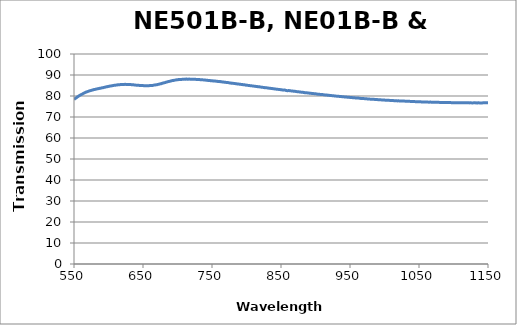
| Category | Series 0 |
|---|---|
| 1150.0 | 76.731 |
| 1149.0 | 76.735 |
| 1148.0 | 76.752 |
| 1147.0 | 76.76 |
| 1146.0 | 76.748 |
| 1145.0 | 76.768 |
| 1144.0 | 76.753 |
| 1143.0 | 76.76 |
| 1142.0 | 76.707 |
| 1141.0 | 76.696 |
| 1140.0 | 76.7 |
| 1139.0 | 76.693 |
| 1138.0 | 76.709 |
| 1137.0 | 76.736 |
| 1136.0 | 76.754 |
| 1135.0 | 76.686 |
| 1134.0 | 76.74 |
| 1133.0 | 76.704 |
| 1132.0 | 76.725 |
| 1131.0 | 76.747 |
| 1130.0 | 76.732 |
| 1129.0 | 76.726 |
| 1128.0 | 76.723 |
| 1127.0 | 76.714 |
| 1126.0 | 76.728 |
| 1125.0 | 76.756 |
| 1124.0 | 76.749 |
| 1123.0 | 76.722 |
| 1122.0 | 76.741 |
| 1121.0 | 76.758 |
| 1120.0 | 76.779 |
| 1119.0 | 76.778 |
| 1118.0 | 76.743 |
| 1117.0 | 76.752 |
| 1116.0 | 76.754 |
| 1115.0 | 76.759 |
| 1114.0 | 76.764 |
| 1113.0 | 76.776 |
| 1112.0 | 76.769 |
| 1111.0 | 76.793 |
| 1110.0 | 76.777 |
| 1109.0 | 76.79 |
| 1108.0 | 76.782 |
| 1107.0 | 76.77 |
| 1106.0 | 76.774 |
| 1105.0 | 76.804 |
| 1104.0 | 76.837 |
| 1103.0 | 76.837 |
| 1102.0 | 76.823 |
| 1101.0 | 76.84 |
| 1100.0 | 76.822 |
| 1099.0 | 76.821 |
| 1098.0 | 76.82 |
| 1097.0 | 76.835 |
| 1096.0 | 76.85 |
| 1095.0 | 76.884 |
| 1094.0 | 76.891 |
| 1093.0 | 76.9 |
| 1092.0 | 76.884 |
| 1091.0 | 76.892 |
| 1090.0 | 76.878 |
| 1089.0 | 76.886 |
| 1088.0 | 76.858 |
| 1087.0 | 76.9 |
| 1086.0 | 76.913 |
| 1085.0 | 76.924 |
| 1084.0 | 76.914 |
| 1083.0 | 76.92 |
| 1082.0 | 76.916 |
| 1081.0 | 76.93 |
| 1080.0 | 76.938 |
| 1079.0 | 76.976 |
| 1078.0 | 76.967 |
| 1077.0 | 76.969 |
| 1076.0 | 76.982 |
| 1075.0 | 77.013 |
| 1074.0 | 77.021 |
| 1073.0 | 77 |
| 1072.0 | 77.013 |
| 1071.0 | 77.022 |
| 1070.0 | 77.044 |
| 1069.0 | 77.051 |
| 1068.0 | 77.059 |
| 1067.0 | 77.091 |
| 1066.0 | 77.101 |
| 1065.0 | 77.067 |
| 1064.0 | 77.06 |
| 1063.0 | 77.094 |
| 1062.0 | 77.092 |
| 1061.0 | 77.11 |
| 1060.0 | 77.131 |
| 1059.0 | 77.154 |
| 1058.0 | 77.158 |
| 1057.0 | 77.163 |
| 1056.0 | 77.172 |
| 1055.0 | 77.168 |
| 1054.0 | 77.157 |
| 1053.0 | 77.211 |
| 1052.0 | 77.227 |
| 1051.0 | 77.246 |
| 1050.0 | 77.252 |
| 1049.0 | 77.249 |
| 1048.0 | 77.273 |
| 1047.0 | 77.282 |
| 1046.0 | 77.271 |
| 1045.0 | 77.293 |
| 1044.0 | 77.328 |
| 1043.0 | 77.353 |
| 1042.0 | 77.351 |
| 1041.0 | 77.374 |
| 1040.0 | 77.36 |
| 1039.0 | 77.368 |
| 1038.0 | 77.387 |
| 1037.0 | 77.437 |
| 1036.0 | 77.443 |
| 1035.0 | 77.473 |
| 1034.0 | 77.463 |
| 1033.0 | 77.468 |
| 1032.0 | 77.483 |
| 1031.0 | 77.515 |
| 1030.0 | 77.551 |
| 1029.0 | 77.562 |
| 1028.0 | 77.573 |
| 1027.0 | 77.564 |
| 1026.0 | 77.59 |
| 1025.0 | 77.584 |
| 1024.0 | 77.616 |
| 1023.0 | 77.633 |
| 1022.0 | 77.66 |
| 1021.0 | 77.672 |
| 1020.0 | 77.693 |
| 1019.0 | 77.667 |
| 1018.0 | 77.692 |
| 1017.0 | 77.725 |
| 1016.0 | 77.757 |
| 1015.0 | 77.766 |
| 1014.0 | 77.782 |
| 1013.0 | 77.803 |
| 1012.0 | 77.823 |
| 1011.0 | 77.846 |
| 1010.0 | 77.859 |
| 1009.0 | 77.865 |
| 1008.0 | 77.887 |
| 1007.0 | 77.923 |
| 1006.0 | 77.947 |
| 1005.0 | 77.968 |
| 1004.0 | 77.977 |
| 1003.0 | 77.993 |
| 1002.0 | 78 |
| 1001.0 | 78.02 |
| 1000.0 | 78.052 |
| 999.0 | 78.08 |
| 998.0 | 78.099 |
| 997.0 | 78.108 |
| 996.0 | 78.136 |
| 995.0 | 78.162 |
| 994.0 | 78.194 |
| 993.0 | 78.222 |
| 992.0 | 78.215 |
| 991.0 | 78.229 |
| 990.0 | 78.271 |
| 989.0 | 78.301 |
| 988.0 | 78.312 |
| 987.0 | 78.337 |
| 986.0 | 78.372 |
| 985.0 | 78.399 |
| 984.0 | 78.405 |
| 983.0 | 78.431 |
| 982.0 | 78.464 |
| 981.0 | 78.484 |
| 980.0 | 78.484 |
| 979.0 | 78.508 |
| 978.0 | 78.54 |
| 977.0 | 78.586 |
| 976.0 | 78.599 |
| 975.0 | 78.617 |
| 974.0 | 78.661 |
| 973.0 | 78.694 |
| 972.0 | 78.706 |
| 971.0 | 78.737 |
| 970.0 | 78.762 |
| 969.0 | 78.786 |
| 968.0 | 78.808 |
| 967.0 | 78.828 |
| 966.0 | 78.846 |
| 965.0 | 78.871 |
| 964.0 | 78.927 |
| 963.0 | 78.981 |
| 962.0 | 79 |
| 961.0 | 79.007 |
| 960.0 | 79.032 |
| 959.0 | 79.048 |
| 958.0 | 79.079 |
| 957.0 | 79.132 |
| 956.0 | 79.166 |
| 955.0 | 79.174 |
| 954.0 | 79.193 |
| 953.0 | 79.25 |
| 952.0 | 79.304 |
| 951.0 | 79.307 |
| 950.0 | 79.327 |
| 949.0 | 79.359 |
| 948.0 | 79.392 |
| 947.0 | 79.431 |
| 946.0 | 79.448 |
| 945.0 | 79.477 |
| 944.0 | 79.521 |
| 943.0 | 79.559 |
| 942.0 | 79.573 |
| 941.0 | 79.592 |
| 940.0 | 79.622 |
| 939.0 | 79.654 |
| 938.0 | 79.695 |
| 937.0 | 79.734 |
| 936.0 | 79.769 |
| 935.0 | 79.799 |
| 934.0 | 79.829 |
| 933.0 | 79.846 |
| 932.0 | 79.868 |
| 931.0 | 79.913 |
| 930.0 | 79.941 |
| 929.0 | 79.981 |
| 928.0 | 80.01 |
| 927.0 | 80.056 |
| 926.0 | 80.085 |
| 925.0 | 80.118 |
| 924.0 | 80.161 |
| 923.0 | 80.193 |
| 922.0 | 80.235 |
| 921.0 | 80.263 |
| 920.0 | 80.298 |
| 919.0 | 80.325 |
| 918.0 | 80.348 |
| 917.0 | 80.417 |
| 916.0 | 80.472 |
| 915.0 | 80.5 |
| 914.0 | 80.506 |
| 913.0 | 80.535 |
| 912.0 | 80.591 |
| 911.0 | 80.649 |
| 910.0 | 80.664 |
| 909.0 | 80.702 |
| 908.0 | 80.73 |
| 907.0 | 80.732 |
| 906.0 | 80.807 |
| 905.0 | 80.877 |
| 904.0 | 80.883 |
| 903.0 | 80.885 |
| 902.0 | 80.951 |
| 901.0 | 81.004 |
| 900.0 | 81.038 |
| 899.0 | 81.04 |
| 898.0 | 81.104 |
| 897.0 | 81.146 |
| 896.0 | 81.182 |
| 895.0 | 81.227 |
| 894.0 | 81.244 |
| 893.0 | 81.285 |
| 892.0 | 81.306 |
| 891.0 | 81.365 |
| 890.0 | 81.418 |
| 889.0 | 81.446 |
| 888.0 | 81.508 |
| 887.0 | 81.529 |
| 886.0 | 81.543 |
| 885.0 | 81.531 |
| 884.0 | 81.614 |
| 883.0 | 81.669 |
| 882.0 | 81.743 |
| 881.0 | 81.778 |
| 880.0 | 81.805 |
| 879.0 | 81.826 |
| 878.0 | 81.898 |
| 877.0 | 81.93 |
| 876.0 | 81.978 |
| 875.0 | 82 |
| 874.0 | 82.041 |
| 873.0 | 82.08 |
| 872.0 | 82.109 |
| 871.0 | 82.203 |
| 870.0 | 82.23 |
| 869.0 | 82.284 |
| 868.0 | 82.283 |
| 867.0 | 82.352 |
| 866.0 | 82.37 |
| 865.0 | 82.42 |
| 864.0 | 82.459 |
| 863.0 | 82.512 |
| 862.0 | 82.575 |
| 861.0 | 82.601 |
| 860.0 | 82.545 |
| 859.0 | 82.527 |
| 858.0 | 82.59 |
| 857.0 | 82.677 |
| 856.0 | 82.797 |
| 855.0 | 82.81 |
| 854.0 | 82.836 |
| 853.0 | 82.792 |
| 852.0 | 82.852 |
| 851.0 | 82.984 |
| 850.0 | 83.019 |
| 849.0 | 83.036 |
| 848.0 | 83.105 |
| 847.0 | 83.13 |
| 846.0 | 83.152 |
| 845.0 | 83.211 |
| 844.0 | 83.246 |
| 843.0 | 83.272 |
| 842.0 | 83.36 |
| 841.0 | 83.362 |
| 840.0 | 83.407 |
| 839.0 | 83.456 |
| 838.0 | 83.503 |
| 837.0 | 83.577 |
| 836.0 | 83.603 |
| 835.0 | 83.631 |
| 834.0 | 83.677 |
| 833.0 | 83.724 |
| 832.0 | 83.752 |
| 831.0 | 83.844 |
| 830.0 | 83.863 |
| 829.0 | 83.91 |
| 828.0 | 83.952 |
| 827.0 | 83.99 |
| 826.0 | 83.981 |
| 825.0 | 84.085 |
| 824.0 | 84.104 |
| 823.0 | 84.121 |
| 822.0 | 84.188 |
| 821.0 | 84.245 |
| 820.0 | 84.29 |
| 819.0 | 84.363 |
| 818.0 | 84.417 |
| 817.0 | 84.41 |
| 816.0 | 84.447 |
| 815.0 | 84.549 |
| 814.0 | 84.539 |
| 813.0 | 84.6 |
| 812.0 | 84.61 |
| 811.0 | 84.681 |
| 810.0 | 84.719 |
| 809.0 | 84.777 |
| 808.0 | 84.82 |
| 807.0 | 84.832 |
| 806.0 | 84.924 |
| 805.0 | 84.938 |
| 804.0 | 84.988 |
| 803.0 | 85.036 |
| 802.0 | 85.062 |
| 801.0 | 85.11 |
| 800.0 | 85.181 |
| 799.0 | 85.167 |
| 798.0 | 85.276 |
| 797.0 | 85.328 |
| 796.0 | 85.362 |
| 795.0 | 85.381 |
| 794.0 | 85.471 |
| 793.0 | 85.472 |
| 792.0 | 85.533 |
| 791.0 | 85.595 |
| 790.0 | 85.605 |
| 789.0 | 85.667 |
| 788.0 | 85.72 |
| 787.0 | 85.684 |
| 786.0 | 85.805 |
| 785.0 | 85.857 |
| 784.0 | 85.884 |
| 783.0 | 85.938 |
| 782.0 | 85.974 |
| 781.0 | 86.016 |
| 780.0 | 86.051 |
| 779.0 | 86.11 |
| 778.0 | 86.091 |
| 777.0 | 86.22 |
| 776.0 | 86.226 |
| 775.0 | 86.264 |
| 774.0 | 86.357 |
| 773.0 | 86.399 |
| 772.0 | 86.38 |
| 771.0 | 86.42 |
| 770.0 | 86.489 |
| 769.0 | 86.519 |
| 768.0 | 86.545 |
| 767.0 | 86.64 |
| 766.0 | 86.617 |
| 765.0 | 86.688 |
| 764.0 | 86.767 |
| 763.0 | 86.742 |
| 762.0 | 86.875 |
| 761.0 | 86.84 |
| 760.0 | 86.882 |
| 759.0 | 86.879 |
| 758.0 | 86.968 |
| 757.0 | 87.001 |
| 756.0 | 87.025 |
| 755.0 | 87.089 |
| 754.0 | 87.088 |
| 753.0 | 87.13 |
| 752.0 | 87.202 |
| 751.0 | 87.184 |
| 750.0 | 87.279 |
| 749.0 | 87.295 |
| 748.0 | 87.282 |
| 747.0 | 87.371 |
| 746.0 | 87.398 |
| 745.0 | 87.409 |
| 744.0 | 87.419 |
| 743.0 | 87.527 |
| 742.0 | 87.484 |
| 741.0 | 87.553 |
| 740.0 | 87.592 |
| 739.0 | 87.593 |
| 738.0 | 87.668 |
| 737.0 | 87.679 |
| 736.0 | 87.69 |
| 735.0 | 87.717 |
| 734.0 | 87.78 |
| 733.0 | 87.776 |
| 732.0 | 87.81 |
| 731.0 | 87.83 |
| 730.0 | 87.814 |
| 729.0 | 87.889 |
| 728.0 | 87.892 |
| 727.0 | 87.901 |
| 726.0 | 87.948 |
| 725.0 | 87.96 |
| 724.0 | 87.95 |
| 723.0 | 87.978 |
| 722.0 | 88.014 |
| 721.0 | 87.984 |
| 720.0 | 88.007 |
| 719.0 | 88.027 |
| 718.0 | 88.008 |
| 717.0 | 88.068 |
| 716.0 | 88.031 |
| 715.0 | 88.02 |
| 714.0 | 88.029 |
| 713.0 | 88.088 |
| 712.0 | 87.967 |
| 711.0 | 88.035 |
| 710.0 | 88.022 |
| 709.0 | 87.974 |
| 708.0 | 87.986 |
| 707.0 | 87.97 |
| 706.0 | 87.893 |
| 705.0 | 87.916 |
| 704.0 | 87.887 |
| 703.0 | 87.864 |
| 702.0 | 87.812 |
| 701.0 | 87.806 |
| 700.0 | 87.686 |
| 699.0 | 87.722 |
| 698.0 | 87.654 |
| 697.0 | 87.576 |
| 696.0 | 87.546 |
| 695.0 | 87.49 |
| 694.0 | 87.391 |
| 693.0 | 87.357 |
| 692.0 | 87.308 |
| 691.0 | 87.183 |
| 690.0 | 87.151 |
| 689.0 | 87.033 |
| 688.0 | 86.945 |
| 687.0 | 86.879 |
| 686.0 | 86.816 |
| 685.0 | 86.7 |
| 684.0 | 86.623 |
| 683.0 | 86.533 |
| 682.0 | 86.382 |
| 681.0 | 86.328 |
| 680.0 | 86.251 |
| 679.0 | 86.156 |
| 678.0 | 86.045 |
| 677.0 | 85.941 |
| 676.0 | 85.818 |
| 675.0 | 85.78 |
| 674.0 | 85.703 |
| 673.0 | 85.602 |
| 672.0 | 85.537 |
| 671.0 | 85.456 |
| 670.0 | 85.363 |
| 669.0 | 85.321 |
| 668.0 | 85.287 |
| 667.0 | 85.191 |
| 666.0 | 85.185 |
| 665.0 | 85.106 |
| 664.0 | 85.041 |
| 663.0 | 85.031 |
| 662.0 | 85.017 |
| 661.0 | 84.963 |
| 660.0 | 84.983 |
| 659.0 | 84.928 |
| 658.0 | 84.89 |
| 657.0 | 84.923 |
| 656.0 | 84.929 |
| 655.0 | 84.898 |
| 654.0 | 84.917 |
| 653.0 | 84.902 |
| 652.0 | 84.872 |
| 651.0 | 84.908 |
| 650.0 | 84.958 |
| 649.0 | 84.945 |
| 648.0 | 84.968 |
| 647.0 | 84.978 |
| 646.0 | 84.959 |
| 645.0 | 85.026 |
| 644.0 | 85.075 |
| 643.0 | 85.083 |
| 642.0 | 85.121 |
| 641.0 | 85.129 |
| 640.0 | 85.16 |
| 639.0 | 85.2 |
| 638.0 | 85.257 |
| 637.0 | 85.286 |
| 636.0 | 85.325 |
| 635.0 | 85.341 |
| 634.0 | 85.356 |
| 633.0 | 85.409 |
| 632.0 | 85.454 |
| 631.0 | 85.444 |
| 630.0 | 85.467 |
| 629.0 | 85.463 |
| 628.0 | 85.485 |
| 627.0 | 85.522 |
| 626.0 | 85.51 |
| 625.0 | 85.527 |
| 624.0 | 85.555 |
| 623.0 | 85.518 |
| 622.0 | 85.463 |
| 621.0 | 85.506 |
| 620.0 | 85.514 |
| 619.0 | 85.485 |
| 618.0 | 85.471 |
| 617.0 | 85.42 |
| 616.0 | 85.39 |
| 615.0 | 85.406 |
| 614.0 | 85.361 |
| 613.0 | 85.292 |
| 612.0 | 85.254 |
| 611.0 | 85.205 |
| 610.0 | 85.139 |
| 609.0 | 85.13 |
| 608.0 | 85.073 |
| 607.0 | 84.999 |
| 606.0 | 84.938 |
| 605.0 | 84.873 |
| 604.0 | 84.813 |
| 603.0 | 84.791 |
| 602.0 | 84.722 |
| 601.0 | 84.633 |
| 600.0 | 84.58 |
| 599.0 | 84.496 |
| 598.0 | 84.411 |
| 597.0 | 84.366 |
| 596.0 | 84.294 |
| 595.0 | 84.186 |
| 594.0 | 84.13 |
| 593.0 | 84.042 |
| 592.0 | 83.96 |
| 591.0 | 83.922 |
| 590.0 | 83.857 |
| 589.0 | 83.752 |
| 588.0 | 83.712 |
| 587.0 | 83.635 |
| 586.0 | 83.554 |
| 585.0 | 83.501 |
| 584.0 | 83.428 |
| 583.0 | 83.348 |
| 582.0 | 83.29 |
| 581.0 | 83.186 |
| 580.0 | 83.126 |
| 579.0 | 83.08 |
| 578.0 | 82.973 |
| 577.0 | 82.857 |
| 576.0 | 82.778 |
| 575.0 | 82.666 |
| 574.0 | 82.571 |
| 573.0 | 82.509 |
| 572.0 | 82.389 |
| 571.0 | 82.257 |
| 570.0 | 82.15 |
| 569.0 | 82.002 |
| 568.0 | 81.893 |
| 567.0 | 81.791 |
| 566.0 | 81.621 |
| 565.0 | 81.446 |
| 564.0 | 81.306 |
| 563.0 | 81.134 |
| 562.0 | 80.903 |
| 561.0 | 80.742 |
| 560.0 | 80.594 |
| 559.0 | 80.398 |
| 558.0 | 80.242 |
| 557.0 | 80.021 |
| 556.0 | 79.787 |
| 555.0 | 79.584 |
| 554.0 | 79.329 |
| 553.0 | 79.095 |
| 552.0 | 78.896 |
| 551.0 | 78.629 |
| 550.0 | 78.362 |